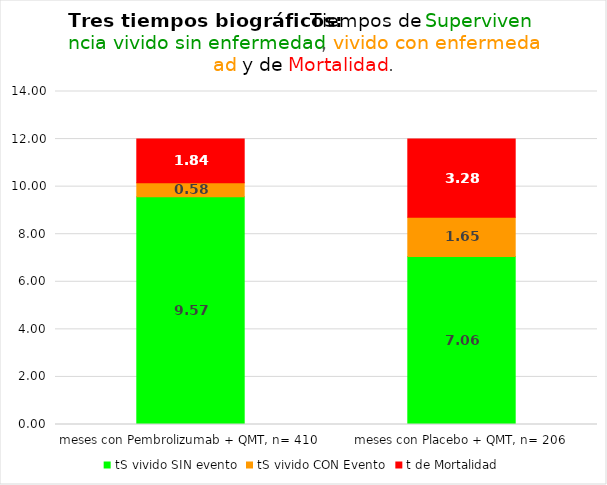
| Category | tS vivido SIN evento | tS vivido CON Evento | t de Mortalidad |
|---|---|---|---|
| meses con Pembrolizumab + QMT, n= 410 | 9.575 | 0.585 | 1.841 |
| meses con Placebo + QMT, n= 206 | 7.063 | 1.655 | 3.282 |